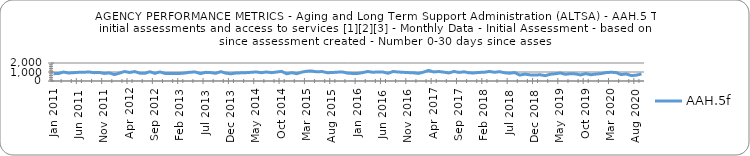
| Category | AAH.5f |
|---|---|
| 2011-01-01 | 813 |
| 2011-02-01 | 837 |
| 2011-03-01 | 994 |
| 2011-04-01 | 886 |
| 2011-05-01 | 928 |
| 2011-06-01 | 967 |
| 2011-07-01 | 974 |
| 2011-08-01 | 1003 |
| 2011-09-01 | 926 |
| 2011-10-01 | 953 |
| 2011-11-01 | 841 |
| 2011-12-01 | 900 |
| 2012-01-01 | 714 |
| 2012-02-01 | 872 |
| 2012-03-01 | 1054 |
| 2012-04-01 | 946 |
| 2012-05-01 | 1049 |
| 2012-06-01 | 874 |
| 2012-07-01 | 850 |
| 2012-08-01 | 1028 |
| 2012-09-01 | 850 |
| 2012-10-01 | 1003 |
| 2012-11-01 | 842 |
| 2012-12-01 | 831 |
| 2013-01-01 | 840 |
| 2013-02-01 | 842 |
| 2013-03-01 | 892 |
| 2013-04-01 | 983 |
| 2013-05-01 | 991 |
| 2013-06-01 | 822 |
| 2013-07-01 | 961 |
| 2013-08-01 | 935 |
| 2013-09-01 | 851 |
| 2013-10-01 | 1038 |
| 2013-11-01 | 872 |
| 2013-12-01 | 797 |
| 2014-01-01 | 890 |
| 2014-02-01 | 905 |
| 2014-03-01 | 925 |
| 2014-04-01 | 965 |
| 2014-05-01 | 1005 |
| 2014-06-01 | 922 |
| 2014-07-01 | 1001 |
| 2014-08-01 | 926 |
| 2014-09-01 | 998 |
| 2014-10-01 | 1068 |
| 2014-11-01 | 802 |
| 2014-12-01 | 923 |
| 2015-01-01 | 815 |
| 2015-02-01 | 988 |
| 2015-03-01 | 1096 |
| 2015-04-01 | 1101 |
| 2015-05-01 | 1015 |
| 2015-06-01 | 1054 |
| 2015-07-01 | 920 |
| 2015-08-01 | 942 |
| 2015-09-01 | 983 |
| 2015-10-01 | 1008 |
| 2015-11-01 | 876 |
| 2015-12-01 | 837 |
| 2016-01-01 | 836 |
| 2016-02-01 | 934 |
| 2016-03-01 | 1056 |
| 2016-04-01 | 969 |
| 2016-05-01 | 1009 |
| 2016-06-01 | 999 |
| 2016-07-01 | 854 |
| 2016-08-01 | 1056 |
| 2016-09-01 | 999 |
| 2016-10-01 | 967 |
| 2016-11-01 | 933 |
| 2016-12-01 | 907 |
| 2017-01-01 | 843 |
| 2017-02-01 | 985 |
| 2017-03-01 | 1177 |
| 2017-04-01 | 1007 |
| 2017-05-01 | 1055 |
| 2017-06-01 | 984 |
| 2017-07-01 | 893 |
| 2017-08-01 | 1061 |
| 2017-09-01 | 953 |
| 2017-10-01 | 1020 |
| 2017-11-01 | 905 |
| 2017-12-01 | 899 |
| 2018-01-01 | 953 |
| 2018-02-01 | 972 |
| 2018-03-01 | 1066 |
| 2018-04-01 | 969 |
| 2018-05-01 | 1035 |
| 2018-06-01 | 911 |
| 2018-07-01 | 864 |
| 2018-08-01 | 936 |
| 2018-09-01 | 659 |
| 2018-10-01 | 765 |
| 2018-11-01 | 681 |
| 2018-12-01 | 658 |
| 2019-01-01 | 695 |
| 2019-02-01 | 591 |
| 2019-03-01 | 753 |
| 2019-04-01 | 802 |
| 2019-05-01 | 891 |
| 2019-06-01 | 740 |
| 2019-07-01 | 816 |
| 2019-08-01 | 786 |
| 2019-09-01 | 675 |
| 2019-10-01 | 820 |
| 2019-11-01 | 695 |
| 2019-12-01 | 767 |
| 2020-01-01 | 821 |
| 2020-02-01 | 929 |
| 2020-03-01 | 973 |
| 2020-04-01 | 939 |
| 2020-05-01 | 711 |
| 2020-06-01 | 783 |
| 2020-07-01 | 600 |
| 2020-08-01 | 650 |
| 2020-09-01 | 786 |